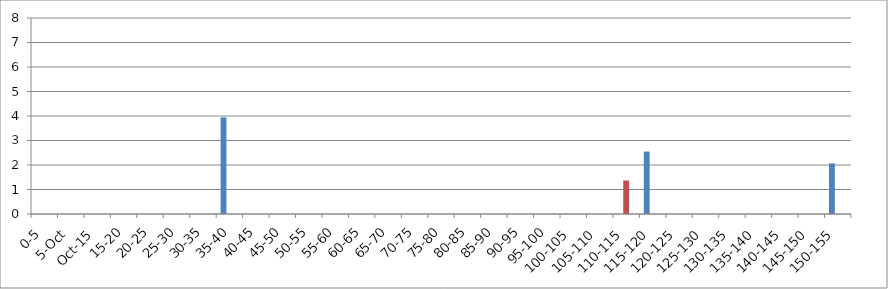
| Category | UNION_ALL | INTERSECTION_ALL | UNION(INTERSECTION_119875_146067,INTERSECTION_119875_241240,INTERSECTION_146067_241240) |
|---|---|---|---|
| 0-5 | 0 | 0 | 0 |
| 5-Oct | 0 | 0 | 0 |
| Oct-15 | 0 | 0 | 0 |
| 15-20 | 0 | 0 | 0 |
| 20-25 | 0 | 0 | 0 |
| 25-30 | 0 | 0 | 0 |
| 30-35 | 0 | 0 | 0 |
| 35-40 | 3.943 | 0 | 0 |
| 40-45 | 0 | 0 | 0 |
| 45-50 | 0 | 0 | 0 |
| 50-55 | 0 | 0 | 0 |
| 55-60 | 0 | 0 | 0 |
| 60-65 | 0 | 0 | 0 |
| 65-70 | 0 | 0 | 0 |
| 70-75 | 0 | 0 | 0 |
| 75-80 | 0 | 0 | 0 |
| 80-85 | 0 | 0 | 0 |
| 85-90 | 0 | 0 | 0 |
| 90-95 | 0 | 0 | 0 |
| 95-100 | 0 | 0 | 0 |
| 100-105 | 0 | 0 | 0 |
| 105-110 | 0 | 0 | 0 |
| 110-115 | 0 | 1.368 | 0 |
| 115-120 | 2.549 | 0 | 0 |
| 120-125 | 0 | 0 | 0 |
| 125-130 | 0 | 0 | 0 |
| 130-135 | 0 | 0 | 0 |
| 135-140 | 0 | 0 | 0 |
| 140-145 | 0 | 0 | 0 |
| 145-150 | 0 | 0 | 0 |
| 150-155 | 2.064 | 0 | 0 |